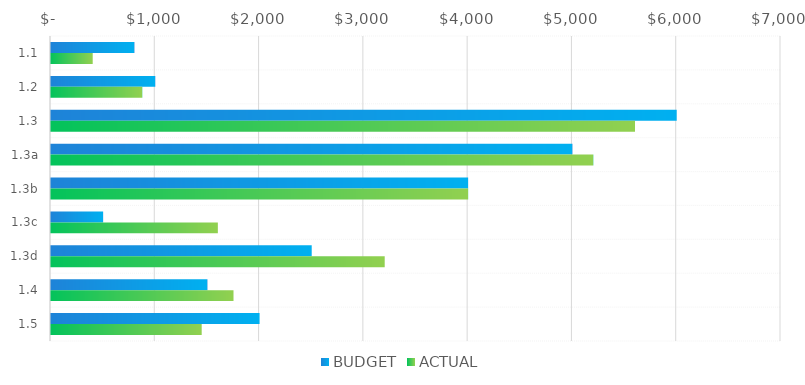
| Category | BUDGET | ACTUAL |
|---|---|---|
| 1.1 | 800 | 400 |
| 1.2 | 1000 | 875 |
| 1.3 | 6000 | 5600 |
| 1.3a | 5000 | 5200 |
| 1.3b | 4000 | 4000 |
| 1.3c | 500 | 1600 |
| 1.3d | 2500 | 3200 |
| 1.4 | 1500 | 1750 |
| 1.5 | 2000 | 1445 |